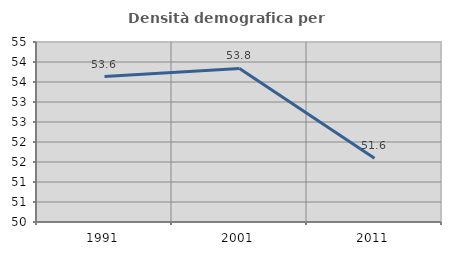
| Category | Densità demografica |
|---|---|
| 1991.0 | 53.637 |
| 2001.0 | 53.838 |
| 2011.0 | 51.592 |